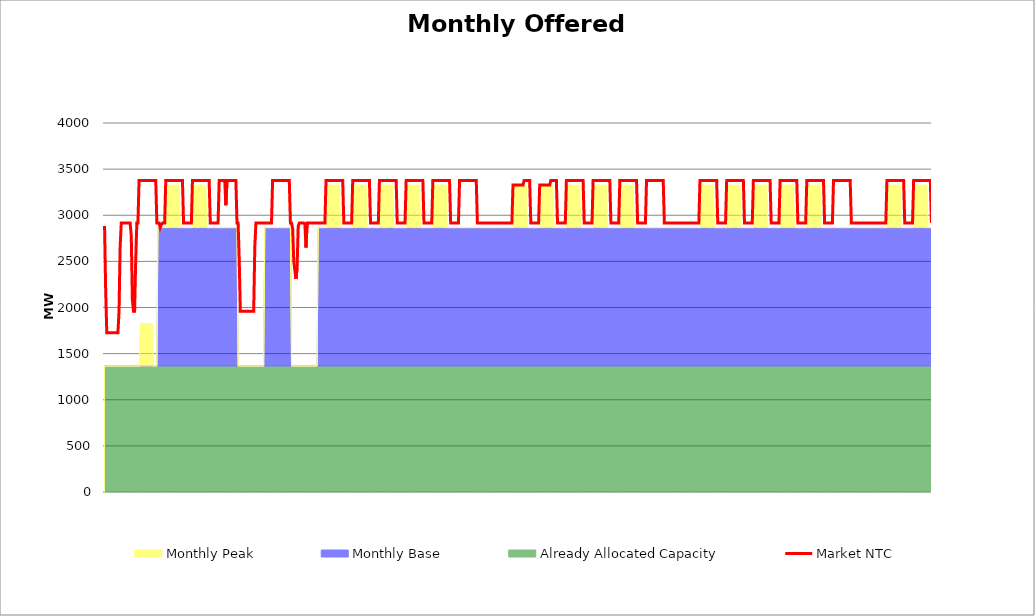
| Category | Market NTC |
|---|---|
| 0 | 2883 |
| 1 | 2189 |
| 2 | 1726 |
| 3 | 1726 |
| 4 | 1726 |
| 5 | 1726 |
| 6 | 1726 |
| 7 | 1726 |
| 8 | 1726 |
| 9 | 1726 |
| 10 | 1726 |
| 11 | 1726 |
| 12 | 1726 |
| 13 | 1958 |
| 14 | 2652 |
| 15 | 2915 |
| 16 | 2915 |
| 17 | 2915 |
| 18 | 2915 |
| 19 | 2915 |
| 20 | 2915 |
| 21 | 2915 |
| 22 | 2915 |
| 23 | 2915 |
| 24 | 2779 |
| 25 | 2085 |
| 26 | 1958 |
| 27 | 1958 |
| 28 | 2522 |
| 29 | 2915 |
| 30 | 2915 |
| 31 | 3377 |
| 32 | 3377 |
| 33 | 3377 |
| 34 | 3377 |
| 35 | 3377 |
| 36 | 3377 |
| 37 | 3377 |
| 38 | 3377 |
| 39 | 3377 |
| 40 | 3377 |
| 41 | 3377 |
| 42 | 3377 |
| 43 | 3377 |
| 44 | 3377 |
| 45 | 3377 |
| 46 | 3377 |
| 47 | 2915 |
| 48 | 2915 |
| 49 | 2915 |
| 50 | 2866 |
| 51 | 2899 |
| 52 | 2915 |
| 53 | 2915 |
| 54 | 2915 |
| 55 | 3377 |
| 56 | 3377 |
| 57 | 3377 |
| 58 | 3377 |
| 59 | 3377 |
| 60 | 3377 |
| 61 | 3377 |
| 62 | 3377 |
| 63 | 3377 |
| 64 | 3377 |
| 65 | 3377 |
| 66 | 3377 |
| 67 | 3377 |
| 68 | 3377 |
| 69 | 3377 |
| 70 | 3377 |
| 71 | 2915 |
| 72 | 2915 |
| 73 | 2915 |
| 74 | 2915 |
| 75 | 2915 |
| 76 | 2915 |
| 77 | 2915 |
| 78 | 2915 |
| 79 | 3377 |
| 80 | 3377 |
| 81 | 3377 |
| 82 | 3377 |
| 83 | 3377 |
| 84 | 3377 |
| 85 | 3377 |
| 86 | 3377 |
| 87 | 3377 |
| 88 | 3377 |
| 89 | 3377 |
| 90 | 3377 |
| 91 | 3377 |
| 92 | 3377 |
| 93 | 3377 |
| 94 | 3377 |
| 95 | 2915 |
| 96 | 2915 |
| 97 | 2915 |
| 98 | 2915 |
| 99 | 2915 |
| 100 | 2915 |
| 101 | 2915 |
| 102 | 2915 |
| 103 | 3377 |
| 104 | 3377 |
| 105 | 3377 |
| 106 | 3377 |
| 107 | 3377 |
| 108 | 3377 |
| 109 | 3108 |
| 110 | 3377 |
| 111 | 3377 |
| 112 | 3377 |
| 113 | 3377 |
| 114 | 3377 |
| 115 | 3377 |
| 116 | 3377 |
| 117 | 3377 |
| 118 | 3377 |
| 119 | 2915 |
| 120 | 2915 |
| 121 | 2522 |
| 122 | 1958 |
| 123 | 1958 |
| 124 | 1958 |
| 125 | 1958 |
| 126 | 1958 |
| 127 | 1958 |
| 128 | 1958 |
| 129 | 1958 |
| 130 | 1958 |
| 131 | 1958 |
| 132 | 1958 |
| 133 | 1958 |
| 134 | 1958 |
| 135 | 2652 |
| 136 | 2915 |
| 137 | 2915 |
| 138 | 2915 |
| 139 | 2915 |
| 140 | 2915 |
| 141 | 2915 |
| 142 | 2915 |
| 143 | 2915 |
| 144 | 2915 |
| 145 | 2915 |
| 146 | 2915 |
| 147 | 2915 |
| 148 | 2915 |
| 149 | 2915 |
| 150 | 2915 |
| 151 | 3377 |
| 152 | 3377 |
| 153 | 3377 |
| 154 | 3377 |
| 155 | 3377 |
| 156 | 3377 |
| 157 | 3377 |
| 158 | 3377 |
| 159 | 3377 |
| 160 | 3377 |
| 161 | 3377 |
| 162 | 3377 |
| 163 | 3377 |
| 164 | 3377 |
| 165 | 3377 |
| 166 | 3377 |
| 167 | 2915 |
| 168 | 2915 |
| 169 | 2855 |
| 170 | 2505 |
| 171 | 2404 |
| 172 | 2309 |
| 173 | 2430 |
| 174 | 2882 |
| 175 | 2915 |
| 176 | 2915 |
| 177 | 2915 |
| 178 | 2915 |
| 179 | 2915 |
| 180 | 2907 |
| 181 | 2650 |
| 182 | 2915 |
| 183 | 2915 |
| 184 | 2915 |
| 185 | 2915 |
| 186 | 2915 |
| 187 | 2915 |
| 188 | 2915 |
| 189 | 2915 |
| 190 | 2915 |
| 191 | 2915 |
| 192 | 2915 |
| 193 | 2915 |
| 194 | 2915 |
| 195 | 2915 |
| 196 | 2915 |
| 197 | 2915 |
| 198 | 2915 |
| 199 | 3377 |
| 200 | 3377 |
| 201 | 3377 |
| 202 | 3377 |
| 203 | 3377 |
| 204 | 3377 |
| 205 | 3377 |
| 206 | 3377 |
| 207 | 3377 |
| 208 | 3377 |
| 209 | 3377 |
| 210 | 3377 |
| 211 | 3377 |
| 212 | 3377 |
| 213 | 3377 |
| 214 | 3377 |
| 215 | 2915 |
| 216 | 2915 |
| 217 | 2915 |
| 218 | 2915 |
| 219 | 2915 |
| 220 | 2915 |
| 221 | 2915 |
| 222 | 2915 |
| 223 | 3377 |
| 224 | 3377 |
| 225 | 3377 |
| 226 | 3377 |
| 227 | 3377 |
| 228 | 3377 |
| 229 | 3377 |
| 230 | 3377 |
| 231 | 3377 |
| 232 | 3377 |
| 233 | 3377 |
| 234 | 3377 |
| 235 | 3377 |
| 236 | 3377 |
| 237 | 3377 |
| 238 | 3377 |
| 239 | 2915 |
| 240 | 2915 |
| 241 | 2915 |
| 242 | 2915 |
| 243 | 2915 |
| 244 | 2915 |
| 245 | 2915 |
| 246 | 2915 |
| 247 | 3377 |
| 248 | 3377 |
| 249 | 3377 |
| 250 | 3377 |
| 251 | 3377 |
| 252 | 3377 |
| 253 | 3377 |
| 254 | 3377 |
| 255 | 3377 |
| 256 | 3377 |
| 257 | 3377 |
| 258 | 3377 |
| 259 | 3377 |
| 260 | 3377 |
| 261 | 3377 |
| 262 | 3377 |
| 263 | 2915 |
| 264 | 2915 |
| 265 | 2915 |
| 266 | 2915 |
| 267 | 2915 |
| 268 | 2915 |
| 269 | 2915 |
| 270 | 2915 |
| 271 | 3377 |
| 272 | 3377 |
| 273 | 3377 |
| 274 | 3377 |
| 275 | 3377 |
| 276 | 3377 |
| 277 | 3377 |
| 278 | 3377 |
| 279 | 3377 |
| 280 | 3377 |
| 281 | 3377 |
| 282 | 3377 |
| 283 | 3377 |
| 284 | 3377 |
| 285 | 3377 |
| 286 | 3377 |
| 287 | 2915 |
| 288 | 2915 |
| 289 | 2915 |
| 290 | 2915 |
| 291 | 2915 |
| 292 | 2915 |
| 293 | 2915 |
| 294 | 2915 |
| 295 | 3377 |
| 296 | 3377 |
| 297 | 3377 |
| 298 | 3377 |
| 299 | 3377 |
| 300 | 3377 |
| 301 | 3377 |
| 302 | 3377 |
| 303 | 3377 |
| 304 | 3377 |
| 305 | 3377 |
| 306 | 3377 |
| 307 | 3377 |
| 308 | 3377 |
| 309 | 3377 |
| 310 | 3377 |
| 311 | 2915 |
| 312 | 2915 |
| 313 | 2915 |
| 314 | 2915 |
| 315 | 2915 |
| 316 | 2915 |
| 317 | 2915 |
| 318 | 2915 |
| 319 | 3377 |
| 320 | 3377 |
| 321 | 3377 |
| 322 | 3377 |
| 323 | 3377 |
| 324 | 3377 |
| 325 | 3377 |
| 326 | 3377 |
| 327 | 3377 |
| 328 | 3377 |
| 329 | 3377 |
| 330 | 3377 |
| 331 | 3377 |
| 332 | 3377 |
| 333 | 3377 |
| 334 | 3377 |
| 335 | 2915 |
| 336 | 2915 |
| 337 | 2915 |
| 338 | 2915 |
| 339 | 2915 |
| 340 | 2915 |
| 341 | 2915 |
| 342 | 2915 |
| 343 | 2915 |
| 344 | 2915 |
| 345 | 2915 |
| 346 | 2915 |
| 347 | 2915 |
| 348 | 2915 |
| 349 | 2915 |
| 350 | 2915 |
| 351 | 2915 |
| 352 | 2915 |
| 353 | 2915 |
| 354 | 2915 |
| 355 | 2915 |
| 356 | 2915 |
| 357 | 2915 |
| 358 | 2915 |
| 359 | 2915 |
| 360 | 2915 |
| 361 | 2915 |
| 362 | 2915 |
| 363 | 2915 |
| 364 | 2915 |
| 365 | 2915 |
| 366 | 2915 |
| 367 | 3327 |
| 368 | 3327 |
| 369 | 3327 |
| 370 | 3327 |
| 371 | 3327 |
| 372 | 3327 |
| 373 | 3327 |
| 374 | 3327 |
| 375 | 3327 |
| 376 | 3327 |
| 377 | 3377 |
| 378 | 3377 |
| 379 | 3377 |
| 380 | 3377 |
| 381 | 3377 |
| 382 | 3377 |
| 383 | 2915 |
| 384 | 2915 |
| 385 | 2915 |
| 386 | 2915 |
| 387 | 2915 |
| 388 | 2915 |
| 389 | 2915 |
| 390 | 2915 |
| 391 | 3327 |
| 392 | 3327 |
| 393 | 3327 |
| 394 | 3327 |
| 395 | 3327 |
| 396 | 3327 |
| 397 | 3327 |
| 398 | 3327 |
| 399 | 3327 |
| 400 | 3327 |
| 401 | 3377 |
| 402 | 3377 |
| 403 | 3377 |
| 404 | 3377 |
| 405 | 3377 |
| 406 | 3377 |
| 407 | 2915 |
| 408 | 2915 |
| 409 | 2915 |
| 410 | 2915 |
| 411 | 2915 |
| 412 | 2915 |
| 413 | 2915 |
| 414 | 2915 |
| 415 | 3377 |
| 416 | 3377 |
| 417 | 3377 |
| 418 | 3377 |
| 419 | 3377 |
| 420 | 3377 |
| 421 | 3377 |
| 422 | 3377 |
| 423 | 3377 |
| 424 | 3377 |
| 425 | 3377 |
| 426 | 3377 |
| 427 | 3377 |
| 428 | 3377 |
| 429 | 3377 |
| 430 | 3377 |
| 431 | 2915 |
| 432 | 2915 |
| 433 | 2915 |
| 434 | 2915 |
| 435 | 2915 |
| 436 | 2915 |
| 437 | 2915 |
| 438 | 2915 |
| 439 | 3377 |
| 440 | 3377 |
| 441 | 3377 |
| 442 | 3377 |
| 443 | 3377 |
| 444 | 3377 |
| 445 | 3377 |
| 446 | 3377 |
| 447 | 3377 |
| 448 | 3377 |
| 449 | 3377 |
| 450 | 3377 |
| 451 | 3377 |
| 452 | 3377 |
| 453 | 3377 |
| 454 | 3377 |
| 455 | 2915 |
| 456 | 2915 |
| 457 | 2915 |
| 458 | 2915 |
| 459 | 2915 |
| 460 | 2915 |
| 461 | 2915 |
| 462 | 2915 |
| 463 | 3377 |
| 464 | 3377 |
| 465 | 3377 |
| 466 | 3377 |
| 467 | 3377 |
| 468 | 3377 |
| 469 | 3377 |
| 470 | 3377 |
| 471 | 3377 |
| 472 | 3377 |
| 473 | 3377 |
| 474 | 3377 |
| 475 | 3377 |
| 476 | 3377 |
| 477 | 3377 |
| 478 | 3377 |
| 479 | 2915 |
| 480 | 2915 |
| 481 | 2915 |
| 482 | 2915 |
| 483 | 2915 |
| 484 | 2915 |
| 485 | 2915 |
| 486 | 2915 |
| 487 | 3377 |
| 488 | 3377 |
| 489 | 3377 |
| 490 | 3377 |
| 491 | 3377 |
| 492 | 3377 |
| 493 | 3377 |
| 494 | 3377 |
| 495 | 3377 |
| 496 | 3377 |
| 497 | 3377 |
| 498 | 3377 |
| 499 | 3377 |
| 500 | 3377 |
| 501 | 3377 |
| 502 | 3377 |
| 503 | 2915 |
| 504 | 2915 |
| 505 | 2915 |
| 506 | 2915 |
| 507 | 2915 |
| 508 | 2915 |
| 509 | 2915 |
| 510 | 2915 |
| 511 | 2915 |
| 512 | 2915 |
| 513 | 2915 |
| 514 | 2915 |
| 515 | 2915 |
| 516 | 2915 |
| 517 | 2915 |
| 518 | 2915 |
| 519 | 2915 |
| 520 | 2915 |
| 521 | 2915 |
| 522 | 2915 |
| 523 | 2915 |
| 524 | 2915 |
| 525 | 2915 |
| 526 | 2915 |
| 527 | 2915 |
| 528 | 2915 |
| 529 | 2915 |
| 530 | 2915 |
| 531 | 2915 |
| 532 | 2915 |
| 533 | 2915 |
| 534 | 2915 |
| 535 | 3377 |
| 536 | 3377 |
| 537 | 3377 |
| 538 | 3377 |
| 539 | 3377 |
| 540 | 3377 |
| 541 | 3377 |
| 542 | 3377 |
| 543 | 3377 |
| 544 | 3377 |
| 545 | 3377 |
| 546 | 3377 |
| 547 | 3377 |
| 548 | 3377 |
| 549 | 3377 |
| 550 | 3377 |
| 551 | 2915 |
| 552 | 2915 |
| 553 | 2915 |
| 554 | 2915 |
| 555 | 2915 |
| 556 | 2915 |
| 557 | 2915 |
| 558 | 2915 |
| 559 | 3377 |
| 560 | 3377 |
| 561 | 3377 |
| 562 | 3377 |
| 563 | 3377 |
| 564 | 3377 |
| 565 | 3377 |
| 566 | 3377 |
| 567 | 3377 |
| 568 | 3377 |
| 569 | 3377 |
| 570 | 3377 |
| 571 | 3377 |
| 572 | 3377 |
| 573 | 3377 |
| 574 | 3377 |
| 575 | 2915 |
| 576 | 2915 |
| 577 | 2915 |
| 578 | 2915 |
| 579 | 2915 |
| 580 | 2915 |
| 581 | 2915 |
| 582 | 2915 |
| 583 | 3377 |
| 584 | 3377 |
| 585 | 3377 |
| 586 | 3377 |
| 587 | 3377 |
| 588 | 3377 |
| 589 | 3377 |
| 590 | 3377 |
| 591 | 3377 |
| 592 | 3377 |
| 593 | 3377 |
| 594 | 3377 |
| 595 | 3377 |
| 596 | 3377 |
| 597 | 3377 |
| 598 | 3377 |
| 599 | 2915 |
| 600 | 2915 |
| 601 | 2915 |
| 602 | 2915 |
| 603 | 2915 |
| 604 | 2915 |
| 605 | 2915 |
| 606 | 2915 |
| 607 | 3377 |
| 608 | 3377 |
| 609 | 3377 |
| 610 | 3377 |
| 611 | 3377 |
| 612 | 3377 |
| 613 | 3377 |
| 614 | 3377 |
| 615 | 3377 |
| 616 | 3377 |
| 617 | 3377 |
| 618 | 3377 |
| 619 | 3377 |
| 620 | 3377 |
| 621 | 3377 |
| 622 | 3377 |
| 623 | 2915 |
| 624 | 2915 |
| 625 | 2915 |
| 626 | 2915 |
| 627 | 2915 |
| 628 | 2915 |
| 629 | 2915 |
| 630 | 2915 |
| 631 | 3377 |
| 632 | 3377 |
| 633 | 3377 |
| 634 | 3377 |
| 635 | 3377 |
| 636 | 3377 |
| 637 | 3377 |
| 638 | 3377 |
| 639 | 3377 |
| 640 | 3377 |
| 641 | 3377 |
| 642 | 3377 |
| 643 | 3377 |
| 644 | 3377 |
| 645 | 3377 |
| 646 | 3377 |
| 647 | 2915 |
| 648 | 2915 |
| 649 | 2915 |
| 650 | 2915 |
| 651 | 2915 |
| 652 | 2915 |
| 653 | 2915 |
| 654 | 2915 |
| 655 | 3377 |
| 656 | 3377 |
| 657 | 3377 |
| 658 | 3377 |
| 659 | 3377 |
| 660 | 3377 |
| 661 | 3377 |
| 662 | 3377 |
| 663 | 3377 |
| 664 | 3377 |
| 665 | 3377 |
| 666 | 3377 |
| 667 | 3377 |
| 668 | 3377 |
| 669 | 3377 |
| 670 | 3377 |
| 671 | 2915 |
| 672 | 2915 |
| 673 | 2915 |
| 674 | 2915 |
| 675 | 2915 |
| 676 | 2915 |
| 677 | 2915 |
| 678 | 2915 |
| 679 | 2915 |
| 680 | 2915 |
| 681 | 2915 |
| 682 | 2915 |
| 683 | 2915 |
| 684 | 2915 |
| 685 | 2915 |
| 686 | 2915 |
| 687 | 2915 |
| 688 | 2915 |
| 689 | 2915 |
| 690 | 2915 |
| 691 | 2915 |
| 692 | 2915 |
| 693 | 2915 |
| 694 | 2915 |
| 695 | 2915 |
| 696 | 2915 |
| 697 | 2915 |
| 698 | 2915 |
| 699 | 2915 |
| 700 | 2915 |
| 701 | 2915 |
| 702 | 2915 |
| 703 | 3377 |
| 704 | 3377 |
| 705 | 3377 |
| 706 | 3377 |
| 707 | 3377 |
| 708 | 3377 |
| 709 | 3377 |
| 710 | 3377 |
| 711 | 3377 |
| 712 | 3377 |
| 713 | 3377 |
| 714 | 3377 |
| 715 | 3377 |
| 716 | 3377 |
| 717 | 3377 |
| 718 | 3377 |
| 719 | 2915 |
| 720 | 2915 |
| 721 | 2915 |
| 722 | 2915 |
| 723 | 2915 |
| 724 | 2915 |
| 725 | 2915 |
| 726 | 2915 |
| 727 | 3377 |
| 728 | 3377 |
| 729 | 3377 |
| 730 | 3377 |
| 731 | 3377 |
| 732 | 3377 |
| 733 | 3377 |
| 734 | 3377 |
| 735 | 3377 |
| 736 | 3377 |
| 737 | 3377 |
| 738 | 3377 |
| 739 | 3377 |
| 740 | 3377 |
| 741 | 3377 |
| 742 | 3377 |
| 743 | 2915 |